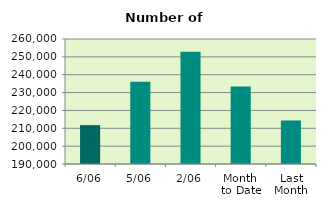
| Category | Series 0 |
|---|---|
| 6/06 | 211760 |
| 5/06 | 236038 |
| 2/06 | 252854 |
| Month 
to Date | 233333.5 |
| Last
Month | 214383.182 |